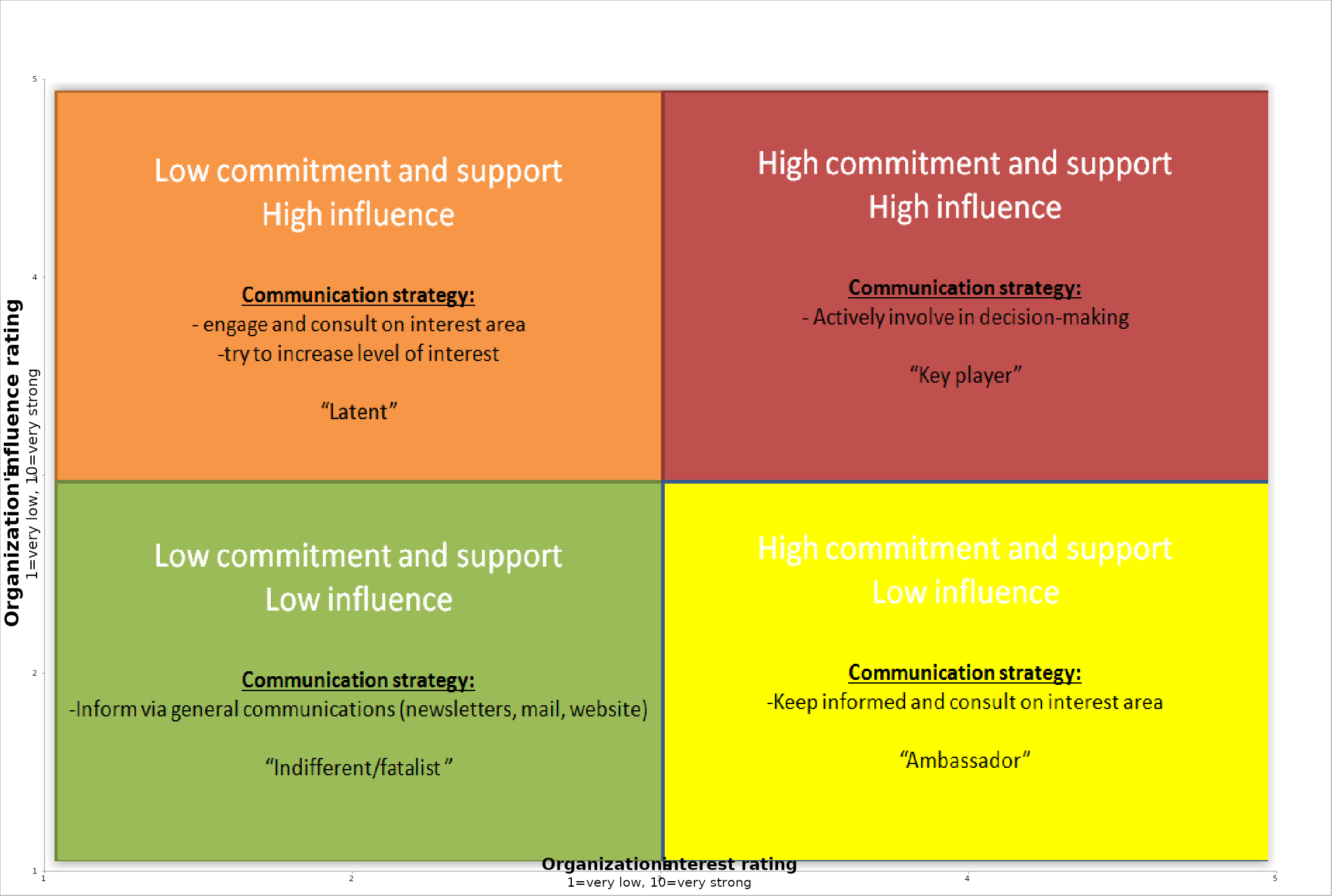
| Category | 0 |
|---|---|
| 0.0 | 0 |